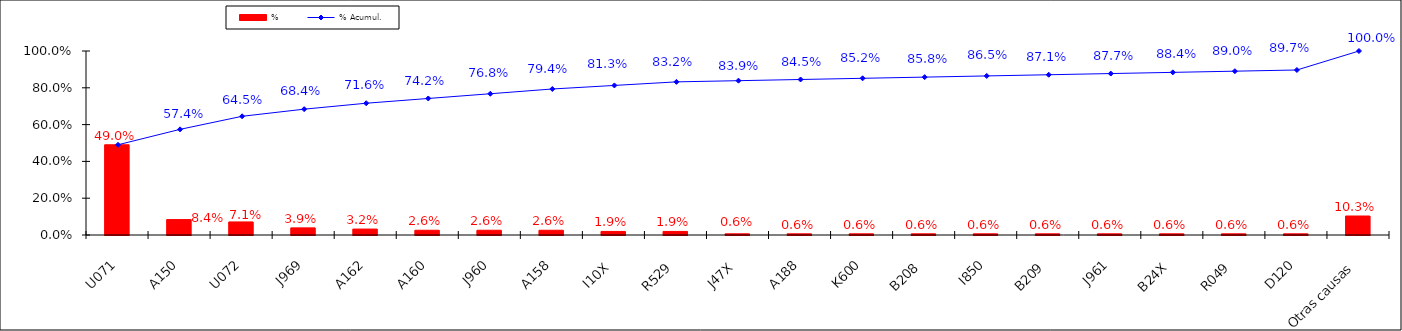
| Category | % |
|---|---|
| U071 | 0.49 |
| A150 | 0.084 |
| U072 | 0.071 |
| J969 | 0.039 |
| A162 | 0.032 |
| A160 | 0.026 |
| J960 | 0.026 |
| A158 | 0.026 |
| I10X | 0.019 |
| R529 | 0.019 |
| J47X | 0.006 |
| A188 | 0.006 |
| K600 | 0.006 |
| B208 | 0.006 |
| I850 | 0.006 |
| B209 | 0.006 |
| J961 | 0.006 |
| B24X | 0.006 |
| R049 | 0.006 |
| D120 | 0.006 |
| Otras causas | 0.103 |